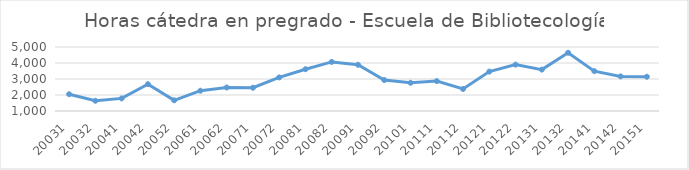
| Category | Total horas |
|---|---|
| 20031 | 2050 |
| 20032 | 1639 |
| 20041 | 1787 |
| 20042 | 2679 |
| 20052 | 1669 |
| 20061 | 2268 |
| 20062 | 2470 |
| 20071 | 2454 |
| 20072 | 3099 |
| 20081 | 3612 |
| 20082 | 4067 |
| 20091 | 3888 |
| 20092 | 2933 |
| 20101 | 2764 |
| 20111 | 2869 |
| 20112 | 2376 |
| 20121 | 3463 |
| 20122 | 3900 |
| 20131 | 3587 |
| 20132 | 4640 |
| 20141 | 3490 |
| 20142 | 3162 |
| 20151 | 3141 |